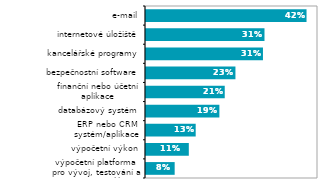
| Category | Series 0 |
|---|---|
| výpočetní platforma pro vývoj, testování a nasazování aplikací | 0.075 |
| výpočetní výkon | 0.112 |
| ERP nebo CRM systém/aplikace | 0.13 |
| databázový systém | 0.192 |
| finanční nebo účetní aplikace | 0.206 |
| bezpečnostní software | 0.234 |
| kancelářské programy | 0.306 |
| internetové úložiště | 0.31 |
| e-mail | 0.42 |